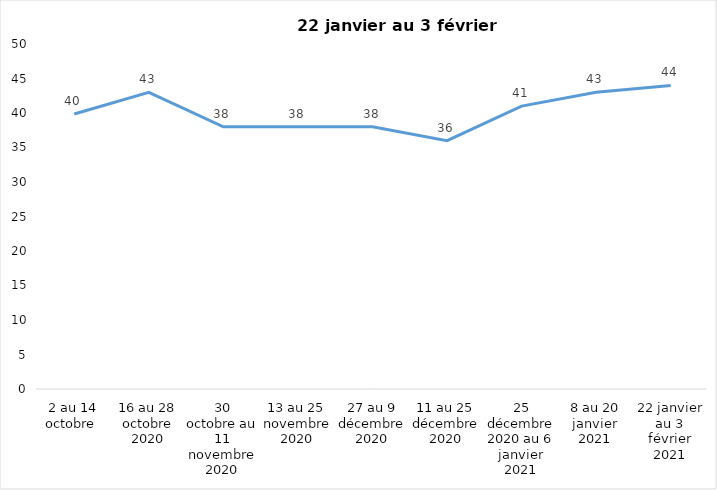
| Category | Toujours aux trois mesures |
|---|---|
| 2 au 14 octobre  | 39.85 |
| 16 au 28 octobre 2020 | 43 |
| 30 octobre au 11 novembre 2020 | 38 |
| 13 au 25 novembre 2020 | 38 |
| 27 au 9 décembre 2020 | 38 |
| 11 au 25 décembre 2020 | 36 |
| 25 décembre 2020 au 6 janvier 2021 | 41 |
| 8 au 20 janvier 2021 | 43 |
| 22 janvier au 3 février 2021 | 44 |